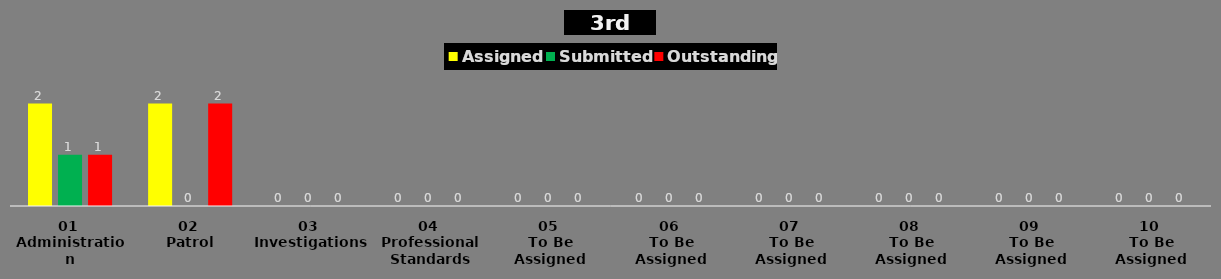
| Category | Assigned | Submitted | Outstanding |
|---|---|---|---|
| 01 
Administration | 2 | 1 | 1 |
| 02 
Patrol | 2 | 0 | 2 |
| 03 
Investigations | 0 | 0 | 0 |
| 04 
Professional Standards | 0 | 0 | 0 |
| 05 
To Be Assigned | 0 | 0 | 0 |
| 06 
To Be Assigned | 0 | 0 | 0 |
| 07 
To Be Assigned | 0 | 0 | 0 |
| 08 
To Be Assigned | 0 | 0 | 0 |
| 09 
To Be Assigned | 0 | 0 | 0 |
| 10 
To Be Assigned | 0 | 0 | 0 |